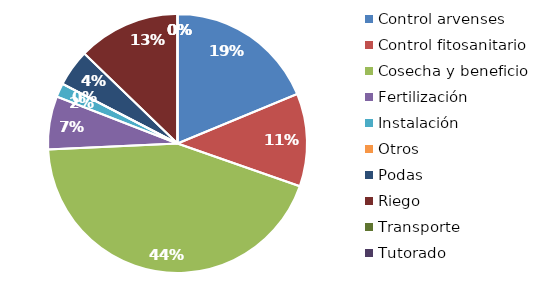
| Category | Valor |
|---|---|
| Control arvenses | 7700000 |
| Control fitosanitario | 4760000 |
| Cosecha y beneficio | 18024064.171 |
| Fertilización | 2730000 |
| Instalación | 700000 |
| Otros | 0 |
| Podas | 1890000 |
| Riego | 5250000 |
| Transporte | 0 |
| Tutorado | 0 |